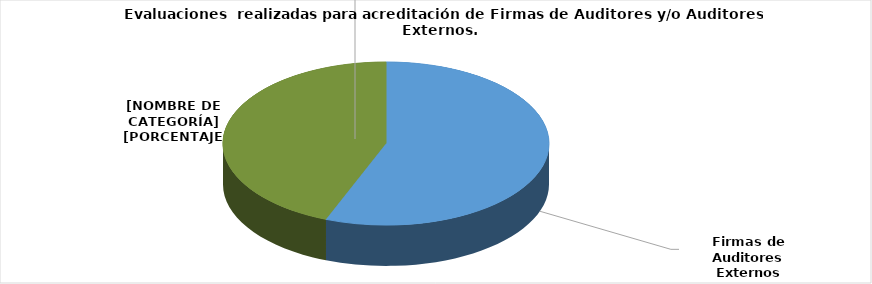
| Category | Series 0 |
|---|---|
| Firmas de Auditores Externos | 14 |
| Auditores Externos | 11 |